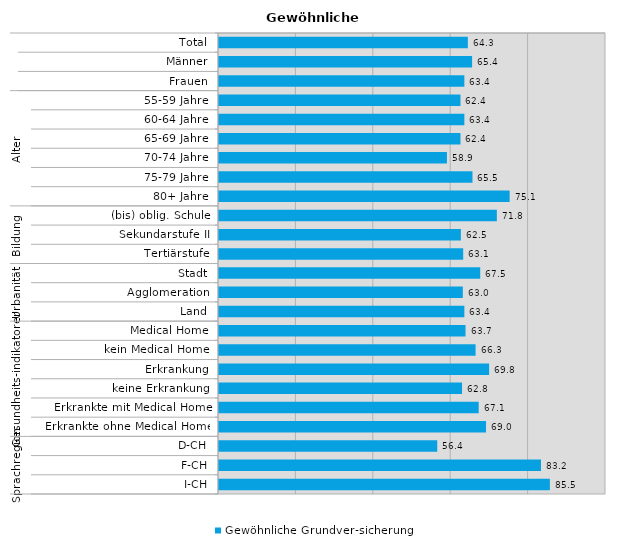
| Category | Gewöhnliche Grundver-sicherung |
|---|---|
| 0 | 64.3 |
| 1 | 65.4 |
| 2 | 63.4 |
| 3 | 62.4 |
| 4 | 63.4 |
| 5 | 62.4 |
| 6 | 58.9 |
| 7 | 65.5 |
| 8 | 75.1 |
| 9 | 71.8 |
| 10 | 62.5 |
| 11 | 63.1 |
| 12 | 67.5 |
| 13 | 63 |
| 14 | 63.4 |
| 15 | 63.7 |
| 16 | 66.3 |
| 17 | 69.8 |
| 18 | 62.8 |
| 19 | 67.1 |
| 20 | 69 |
| 21 | 56.4 |
| 22 | 83.2 |
| 23 | 85.5 |